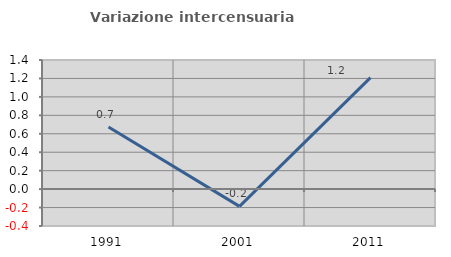
| Category | Variazione intercensuaria annua |
|---|---|
| 1991.0 | 0.674 |
| 2001.0 | -0.187 |
| 2011.0 | 1.209 |